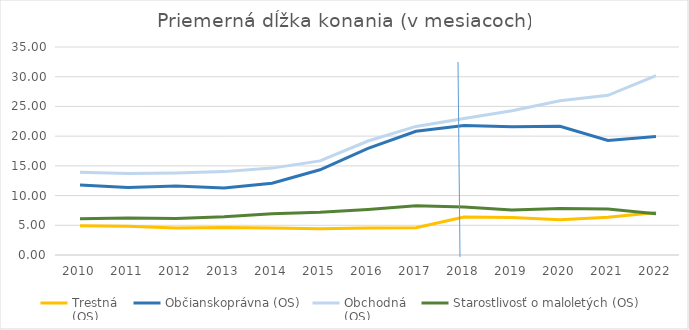
| Category | Trestná
(OS) | Občianskoprávna (OS) | Obchodná
(OS) | Starostlivosť o maloletých (OS) | Správna
(OS+KS) |
|---|---|---|---|---|---|
| 2010.0 | 4.92 | 11.77 | 13.94 | 6.12 |  |
| 2011.0 | 4.83 | 11.35 | 13.7 | 6.22 |  |
| 2012.0 | 4.53 | 11.59 | 13.78 | 6.13 |  |
| 2013.0 | 4.63 | 11.28 | 14.03 | 6.44 |  |
| 2014.0 | 4.53 | 12.07 | 14.62 | 6.95 |  |
| 2015.0 | 4.41 | 14.34 | 15.84 | 7.21 |  |
| 2016.0 | 4.53 | 17.94 | 19.18 | 7.67 |  |
| 2017.0 | 4.582 | 20.809 | 21.635 | 8.287 |  |
| 2018.0 | 6.4 | 21.78 | 22.98 | 8.08 |  |
| 2019.0 | 6.3 | 21.6 | 24.28 | 7.59 |  |
| 2020.0 | 5.92 | 21.66 | 25.94 | 7.84 |  |
| 2021.0 | 6.37 | 19.28 | 26.87 | 7.75 |  |
| 2022.0 | 7.15 | 19.93 | 30.19 | 6.93 |  |